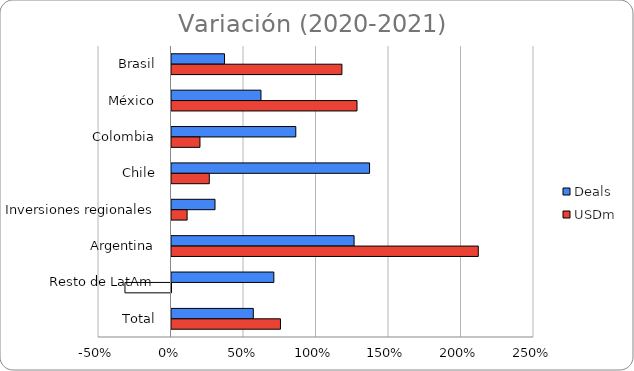
| Category | Deals | USDm |
|---|---|---|
| Brasil | 0.366 | 1.175 |
| México | 0.617 | 1.279 |
| Colombia | 0.857 | 0.196 |
| Chile | 1.366 | 0.261 |
| Inversiones regionales | 0.3 | 0.108 |
| Argentina | 1.259 | 2.116 |
| Resto de LatAm | 0.706 | -0.318 |
| Total | 0.564 | 0.751 |